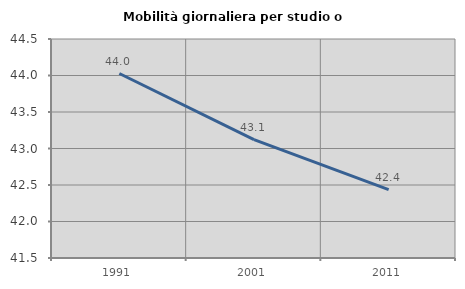
| Category | Mobilità giornaliera per studio o lavoro |
|---|---|
| 1991.0 | 44.027 |
| 2001.0 | 43.121 |
| 2011.0 | 42.438 |